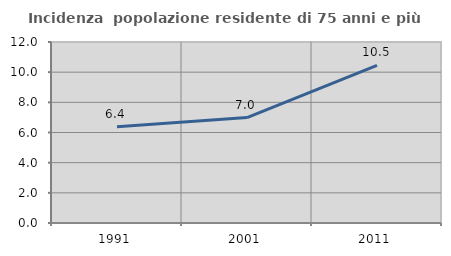
| Category | Incidenza  popolazione residente di 75 anni e più |
|---|---|
| 1991.0 | 6.385 |
| 2001.0 | 6.987 |
| 2011.0 | 10.45 |